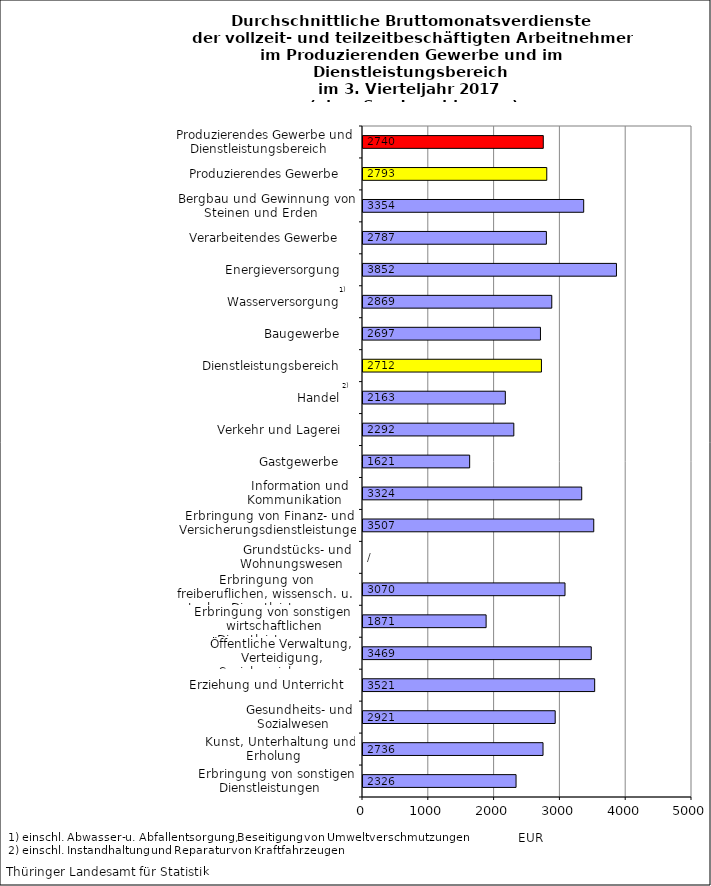
| Category | Series 0 |
|---|---|
| Erbringung von sonstigen Dienstleistungen    | 2326 |
| Kunst, Unterhaltung und Erholung    | 2736 |
| Gesundheits- und Sozialwesen    | 2921 |
| Erziehung und Unterricht    | 3521 |
| Öffentliche Verwaltung, Verteidigung, Sozialversicherung    | 3469 |
| Erbringung von sonstigen  wirtschaftlichen Dienstleistungen    | 1871 |
| Erbringung von freiberuflichen, wissensch. u. techn. Dienstleistungen    | 3070 |
| Grundstücks- und Wohnungswesen    | 0 |
| Erbringung von Finanz- und Versicherungsdienstleistungen    | 3507 |
| Information und Kommunikation    | 3324 |
| Gastgewerbe    | 1621 |
| Verkehr und Lagerei    | 2292 |
| Handel    | 2163 |
| Dienstleistungsbereich    | 2712 |
| Baugewerbe    | 2697 |
| Wasserversorgung    | 2869 |
| Energieversorgung    | 3852 |
| Verarbeitendes Gewerbe    | 2787 |
| Bergbau und Gewinnung von Steinen und Erden    | 3354 |
| Produzierendes Gewerbe    | 2793 |
| Produzierendes Gewerbe und Dienstleistungsbereich    | 2740 |